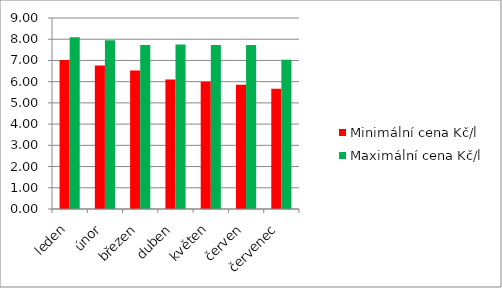
| Category | Minimální cena Kč/l | Maximální cena Kč/l |
|---|---|---|
| leden | 7.02 | 8.09 |
| únor | 6.76 | 7.95 |
| březen | 6.53 | 7.73 |
| duben | 6.1 | 7.75 |
| květen | 6 | 7.73 |
| červen | 5.86 | 7.73 |
| červenec | 5.67 | 7.03 |